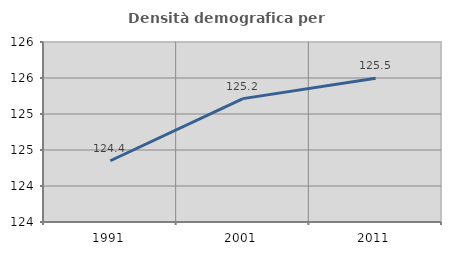
| Category | Densità demografica |
|---|---|
| 1991.0 | 124.351 |
| 2001.0 | 125.214 |
| 2011.0 | 125.497 |